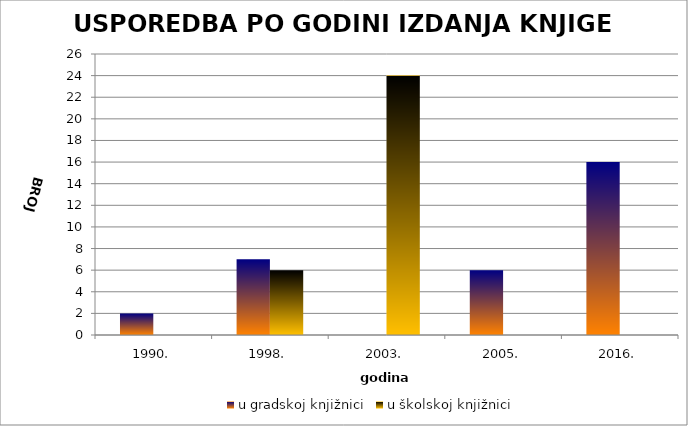
| Category | u gradskoj knjižnici | u školskoj knjižnici |
|---|---|---|
| 1990. | 2 | 0 |
| 1998. | 7 | 6 |
| 2003. | 0 | 24 |
| 2005. | 6 | 0 |
| 2016. | 16 | 0 |